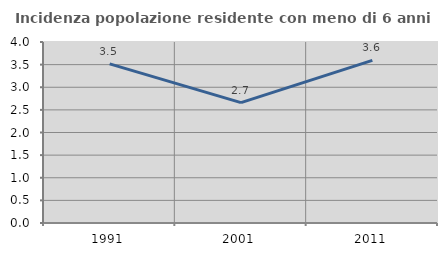
| Category | Incidenza popolazione residente con meno di 6 anni |
|---|---|
| 1991.0 | 3.518 |
| 2001.0 | 2.66 |
| 2011.0 | 3.595 |